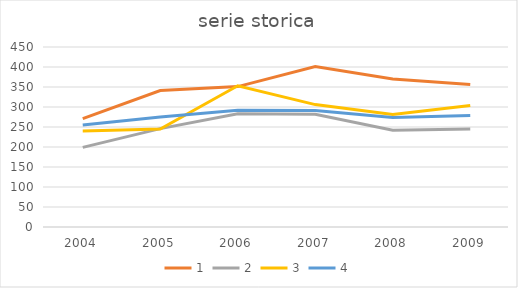
| Category | 1 | 2 | 3 | 4 |
|---|---|---|---|---|
| 2004.0 | 271 | 199 | 240 | 255 |
| 2005.0 | 341 | 246 | 245 | 275 |
| 2006.0 | 351 | 283 | 353 | 292 |
| 2007.0 | 401 | 282 | 306 | 291 |
| 2008.0 | 370 | 242 | 281 | 274 |
| 2009.0 | 356 | 245 | 304 | 279 |